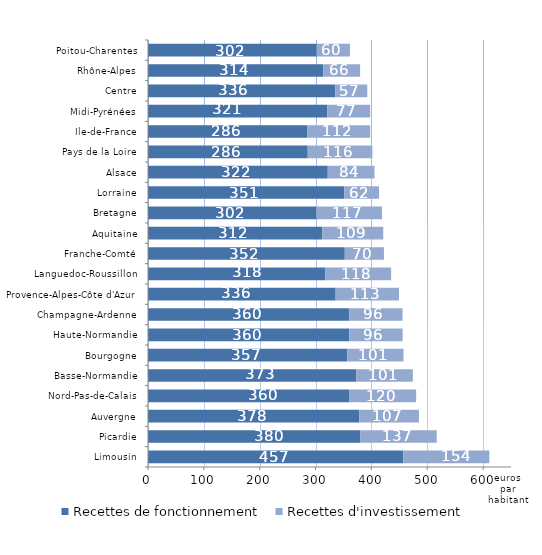
| Category | Recettes de fonctionnement | Recettes d'investissement |
|---|---|---|
| Limousin | 457.26 | 153.917 |
| Picardie | 380.392 | 136.584 |
| Auvergne | 378.256 | 106.851 |
| Nord-Pas-de-Calais | 359.963 | 120.162 |
| Basse-Normandie | 373.017 | 101.24 |
| Bourgogne | 356.679 | 100.854 |
| Haute-Normandie | 360.334 | 95.606 |
| Champagne-Ardenne | 360.288 | 95.517 |
| Provence-Alpes-Côte d'Azur | 336.027 | 113.377 |
| Languedoc-Roussillon | 317.828 | 117.504 |
| Franche-Comté | 352.338 | 70.128 |
| Aquitaine | 312.29 | 108.949 |
| Bretagne | 301.694 | 117.286 |
| Lorraine | 351.404 | 62.341 |
| Alsace | 321.866 | 83.713 |
| Pays de la Loire | 286.028 | 115.786 |
| Ile-de-France | 285.676 | 112.147 |
| Midi-Pyrénées | 321.248 | 76.549 |
| Centre | 335.524 | 57.096 |
| Rhône-Alpes | 313.903 | 65.907 |
| Poitou-Charentes | 302.1 | 59.519 |